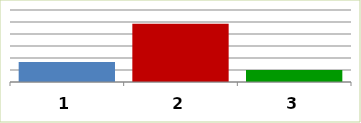
| Category | Series 0 |
|---|---|
| 0 | 83769690 |
| 1 | 242532241 |
| 2 | 49605625 |